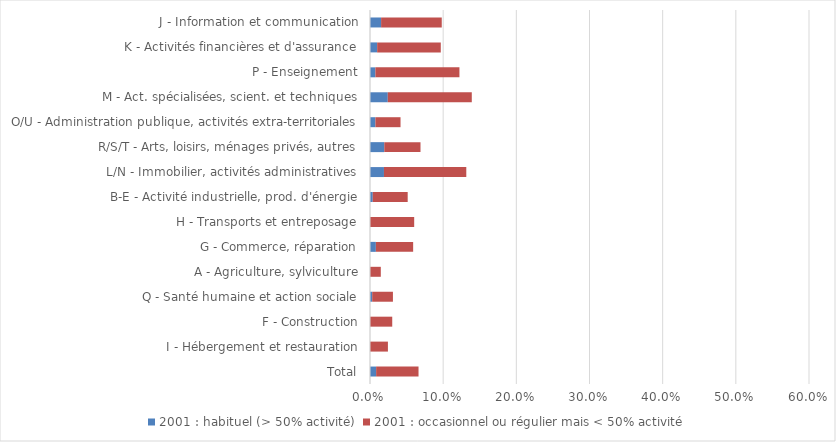
| Category | 2001 : habituel (> 50% activité) | 2001 : occasionnel ou régulier mais < 50% activité |
|---|---|---|
| Total | 0.008 | 0.058 |
| I - Hébergement et restauration | 0 | 0.024 |
| F - Construction | 0 | 0.03 |
| Q - Santé humaine et action sociale | 0.003 | 0.028 |
| A - Agriculture, sylviculture | 0 | 0.015 |
| G - Commerce, réparation | 0.008 | 0.051 |
| H - Transports et entreposage | 0 | 0.06 |
| B-E - Activité industrielle, prod. d'énergie | 0.004 | 0.048 |
| L/N - Immobilier, activités administratives | 0.019 | 0.113 |
| R/S/T - Arts, loisirs, ménages privés, autres | 0.02 | 0.049 |
| O/U - Administration publique, activités extra-territoriales | 0.007 | 0.034 |
| M - Act. spécialisées, scient. et techniques | 0.024 | 0.115 |
| P - Enseignement | 0.007 | 0.115 |
| K - Activités financières et d'assurance | 0.01 | 0.087 |
| J - Information et communication | 0.015 | 0.083 |